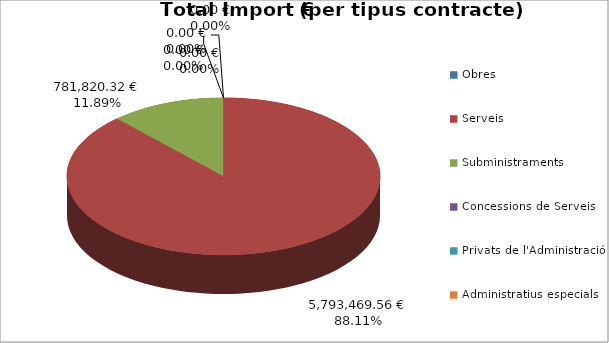
| Category | Total preu              (amb iva) |
|---|---|
| Obres | 0 |
| Serveis | 5793469.557 |
| Subministraments | 781820.319 |
| Concessions de Serveis | 0 |
| Privats de l'Administració | 0 |
| Administratius especials | 0 |